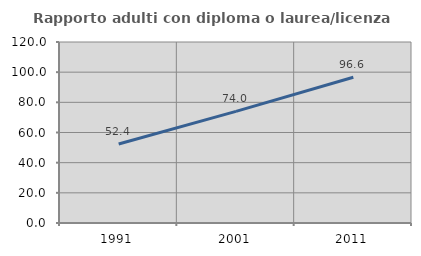
| Category | Rapporto adulti con diploma o laurea/licenza media  |
|---|---|
| 1991.0 | 52.381 |
| 2001.0 | 73.978 |
| 2011.0 | 96.629 |